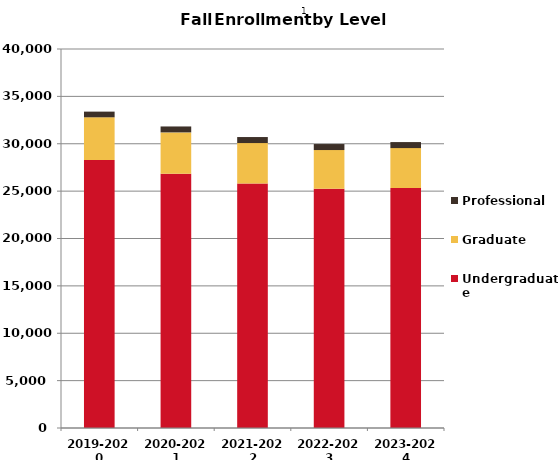
| Category | Undergraduate | Graduate | Professional |
|---|---|---|---|
| 2019-2020 | 28294 | 4498 | 599 |
| 2020-2021 | 26846 | 4352 | 627 |
| 2021-2022 | 25808 | 4264 | 636 |
| 2022-2023 | 25241 | 4094 | 634 |
| 2023-2024 | 25332 | 4210 | 635 |